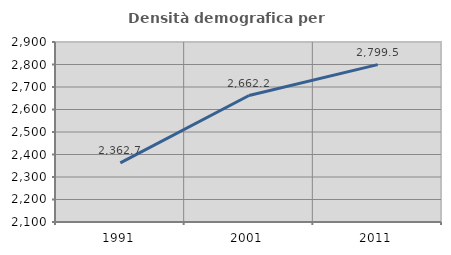
| Category | Densità demografica |
|---|---|
| 1991.0 | 2362.687 |
| 2001.0 | 2662.185 |
| 2011.0 | 2799.498 |